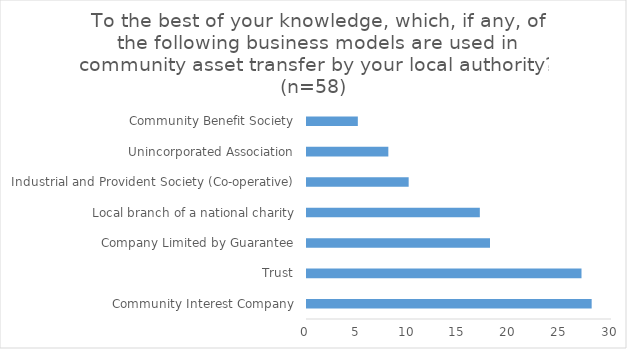
| Category | Series 0 |
|---|---|
| Community Interest Company | 28 |
| Trust | 27 |
| Company Limited by Guarantee | 18 |
| Local branch of a national charity | 17 |
| Industrial and Provident Society (Co-operative) | 10 |
| Unincorporated Association | 8 |
| Community Benefit Society | 5 |